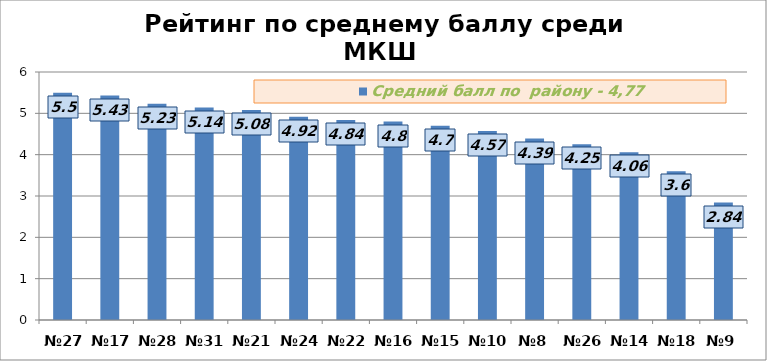
| Category | Средний балл по  району - 4,77 |
|---|---|
| №27 | 5.5 |
| №17 | 5.43 |
| №28 | 5.23 |
| №31 | 5.14 |
| №21 | 5.08 |
| №24 | 4.92 |
| №22 | 4.84 |
| №16 | 4.8 |
| №15 | 4.7 |
| №10 | 4.57 |
| №8 | 4.39 |
| №26 | 4.25 |
| №14 | 4.06 |
| №18 | 3.6 |
| №9 | 2.84 |